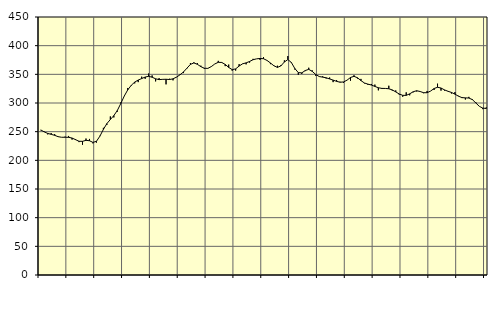
| Category | Piggar | Series 1 |
|---|---|---|
| nan | 252.4 | 253.02 |
| 87.0 | 250.3 | 249.66 |
| 87.0 | 245.3 | 246.95 |
| 87.0 | 247.5 | 245.33 |
| nan | 245.7 | 243.61 |
| 88.0 | 240.7 | 241.26 |
| 88.0 | 240.2 | 240.21 |
| 88.0 | 241.3 | 240.27 |
| nan | 242.5 | 240.1 |
| 89.0 | 236.2 | 238.89 |
| 89.0 | 237.1 | 236.08 |
| 89.0 | 231.8 | 233.23 |
| nan | 227.2 | 233.14 |
| 90.0 | 238 | 234.91 |
| 90.0 | 237.3 | 234.18 |
| 90.0 | 229.6 | 231.3 |
| nan | 230.9 | 233.17 |
| 91.0 | 242.8 | 242.17 |
| 91.0 | 256.7 | 253.99 |
| 91.0 | 261.8 | 264.04 |
| nan | 276.6 | 271.22 |
| 92.0 | 274.8 | 278.05 |
| 92.0 | 284.8 | 286.91 |
| 92.0 | 301 | 299.06 |
| nan | 312.2 | 312.14 |
| 93.0 | 326.2 | 322.94 |
| 93.0 | 330.1 | 330.84 |
| 93.0 | 334.2 | 336.45 |
| nan | 336.4 | 340.04 |
| 94.0 | 345.9 | 342.6 |
| 94.0 | 342.2 | 345.29 |
| 94.0 | 351.4 | 346.49 |
| nan | 348.1 | 344.98 |
| 95.0 | 337.7 | 342.19 |
| 95.0 | 343.4 | 340.79 |
| 95.0 | 340.9 | 341.26 |
| nan | 332.5 | 341.4 |
| 96.0 | 342.3 | 340.98 |
| 96.0 | 339.5 | 342.11 |
| 96.0 | 344.9 | 345.15 |
| nan | 349.8 | 349.09 |
| 97.0 | 352.2 | 354.08 |
| 97.0 | 360.1 | 360.7 |
| 97.0 | 369.5 | 367.34 |
| nan | 371 | 369.87 |
| 98.0 | 369.6 | 367.49 |
| 98.0 | 365.1 | 363.4 |
| 98.0 | 359.5 | 360.62 |
| nan | 360 | 360.34 |
| 99.0 | 363.8 | 363.5 |
| 99.0 | 368.1 | 368.06 |
| 99.0 | 373.5 | 370.96 |
| nan | 371.3 | 370.71 |
| 0.0 | 364.3 | 367.31 |
| 0.0 | 367 | 362.07 |
| 0.0 | 356.4 | 358.19 |
| nan | 356.6 | 359.5 |
| 1.0 | 367.8 | 364.46 |
| 1.0 | 368.1 | 368.36 |
| 1.0 | 367.4 | 370.01 |
| nan | 370.5 | 372.42 |
| 2.0 | 377 | 375.5 |
| 2.0 | 377 | 377.01 |
| 2.0 | 375.2 | 377.69 |
| nan | 379.9 | 377.23 |
| 3.0 | 374.5 | 374.29 |
| 3.0 | 367.8 | 369.79 |
| 3.0 | 365.3 | 364.87 |
| nan | 365 | 362.07 |
| 4.0 | 366 | 364.72 |
| 4.0 | 374.4 | 371.59 |
| 4.0 | 381.9 | 375.72 |
| nan | 369.9 | 370.67 |
| 5.0 | 358.4 | 360.18 |
| 5.0 | 349.2 | 353.02 |
| 5.0 | 350.7 | 352.57 |
| nan | 355.6 | 356.63 |
| 6.0 | 361.5 | 358.69 |
| 6.0 | 356.8 | 355.2 |
| 6.0 | 347.4 | 349.74 |
| nan | 346.1 | 346.21 |
| 7.0 | 346.6 | 345.1 |
| 7.0 | 342.7 | 343.99 |
| 7.0 | 344.5 | 341.96 |
| nan | 336.4 | 339.9 |
| 8.0 | 340.1 | 337.77 |
| 8.0 | 337 | 336.22 |
| 8.0 | 335.2 | 336.73 |
| nan | 339.8 | 339.83 |
| 9.0 | 338.9 | 344.52 |
| 9.0 | 348.4 | 346.54 |
| 9.0 | 342.7 | 344.02 |
| nan | 342 | 339.06 |
| 10.0 | 334.3 | 334.9 |
| 10.0 | 331.7 | 332.92 |
| 10.0 | 333.2 | 331.33 |
| nan | 332.1 | 328.89 |
| 11.0 | 322.1 | 326.61 |
| 11.0 | 324.5 | 325.47 |
| 11.0 | 325.3 | 325.39 |
| nan | 330.1 | 324.83 |
| 12.0 | 321.6 | 322.81 |
| 12.0 | 321.9 | 319.37 |
| 12.0 | 314.6 | 315.7 |
| nan | 310.9 | 313.39 |
| 13.0 | 318.6 | 313.29 |
| 13.0 | 313.4 | 315.96 |
| 13.0 | 318.6 | 319.61 |
| nan | 320.1 | 321.4 |
| 14.0 | 320.3 | 320.05 |
| 14.0 | 317.1 | 317.96 |
| 14.0 | 321 | 317.88 |
| nan | 320.9 | 320.81 |
| 15.0 | 322.7 | 325.23 |
| 15.0 | 333.7 | 327.43 |
| 15.0 | 321.6 | 326.16 |
| nan | 321.7 | 322.85 |
| 16.0 | 320.7 | 320.45 |
| 16.0 | 316.5 | 318.44 |
| 16.0 | 319 | 315.45 |
| nan | 312.5 | 311.92 |
| 17.0 | 308.6 | 309.45 |
| 17.0 | 306.1 | 308.92 |
| 17.0 | 310.7 | 308.64 |
| nan | 306.9 | 305.95 |
| 18.0 | 301.3 | 300.12 |
| 18.0 | 294.2 | 294.21 |
| 18.0 | 289.3 | 291.13 |
| nan | 292.3 | 290.44 |